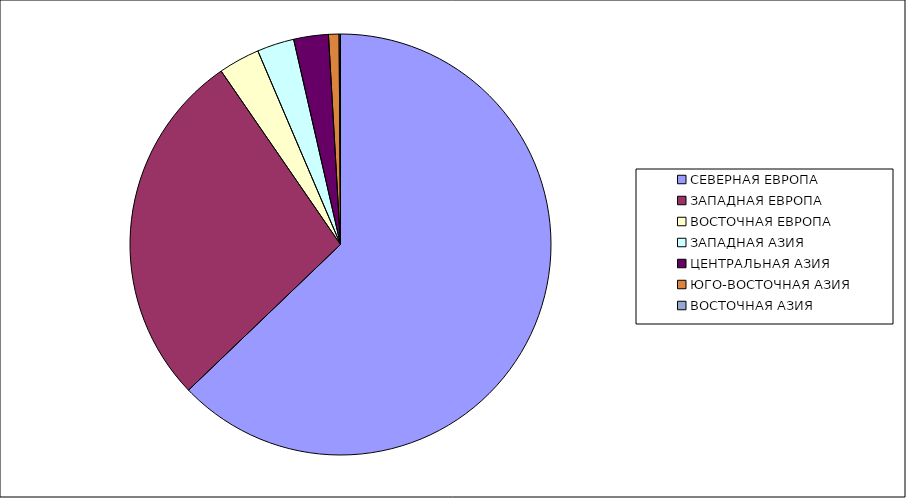
| Category | Оборот |
|---|---|
| СЕВЕРНАЯ ЕВРОПА | 62.838 |
| ЗАПАДНАЯ ЕВРОПА | 27.568 |
| ВОСТОЧНАЯ ЕВРОПА | 3.17 |
| ЗАПАДНАЯ АЗИЯ | 2.848 |
| ЦЕНТРАЛЬНАЯ АЗИЯ | 2.66 |
| ЮГО-ВОСТОЧНАЯ АЗИЯ | 0.808 |
| ВОСТОЧНАЯ АЗИЯ | 0.107 |